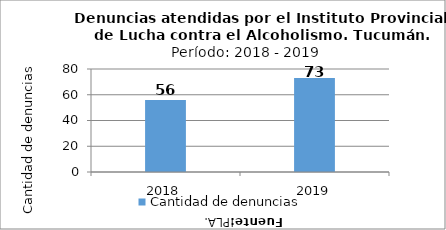
| Category | Cantidad de denuncias |
|---|---|
| 2018.0 | 56 |
| 2019.0 | 73 |